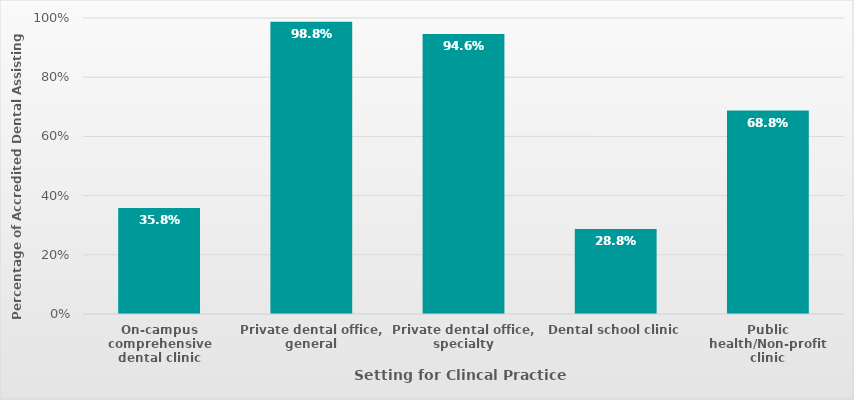
| Category | All Programs |
|---|---|
| On-campus comprehensive dental clinic | 0.358 |
| Private dental office, general | 0.988 |
| Private dental office, specialty | 0.946 |
| Dental school clinic | 0.288 |
| Public health/Non-profit clinic | 0.688 |